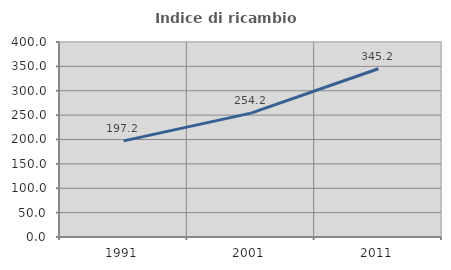
| Category | Indice di ricambio occupazionale  |
|---|---|
| 1991.0 | 197.222 |
| 2001.0 | 254.167 |
| 2011.0 | 345.161 |